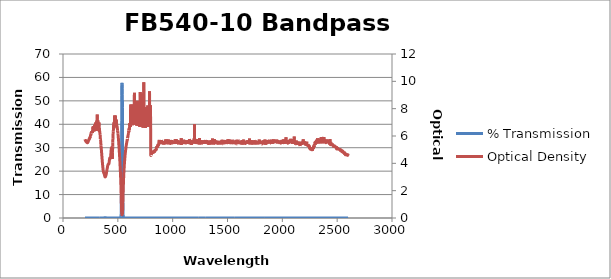
| Category | % Transmission |
|---|---|
| 2600.0 | 0.003 |
| 2599.0 | 0.002 |
| 2598.0 | 0.003 |
| 2597.0 | 0.002 |
| 2596.0 | 0.002 |
| 2595.0 | 0.002 |
| 2594.0 | 0.003 |
| 2593.0 | 0.003 |
| 2592.0 | 0.003 |
| 2591.0 | 0.003 |
| 2590.0 | 0.002 |
| 2589.0 | 0.002 |
| 2588.0 | 0.002 |
| 2587.0 | 0.003 |
| 2586.0 | 0.002 |
| 2585.0 | 0.002 |
| 2584.0 | 0.002 |
| 2583.0 | 0.003 |
| 2582.0 | 0.002 |
| 2581.0 | 0.002 |
| 2580.0 | 0.002 |
| 2579.0 | 0.003 |
| 2578.0 | 0.002 |
| 2577.0 | 0.002 |
| 2576.0 | 0.002 |
| 2575.0 | 0.002 |
| 2574.0 | 0.002 |
| 2573.0 | 0.002 |
| 2572.0 | 0.002 |
| 2571.0 | 0.002 |
| 2570.0 | 0.002 |
| 2569.0 | 0.002 |
| 2568.0 | 0.002 |
| 2567.0 | 0.002 |
| 2566.0 | 0.002 |
| 2565.0 | 0.002 |
| 2564.0 | 0.002 |
| 2563.0 | 0.002 |
| 2562.0 | 0.002 |
| 2561.0 | 0.002 |
| 2560.0 | 0.001 |
| 2559.0 | 0.002 |
| 2558.0 | 0.002 |
| 2557.0 | 0.001 |
| 2556.0 | 0.001 |
| 2555.0 | 0.001 |
| 2554.0 | 0.001 |
| 2553.0 | 0.001 |
| 2552.0 | 0.002 |
| 2551.0 | 0.001 |
| 2550.0 | 0.001 |
| 2549.0 | 0.001 |
| 2548.0 | 0.001 |
| 2547.0 | 0.001 |
| 2546.0 | 0.001 |
| 2545.0 | 0.001 |
| 2544.0 | 0.002 |
| 2543.0 | 0.001 |
| 2542.0 | 0.001 |
| 2541.0 | 0.001 |
| 2540.0 | 0.001 |
| 2539.0 | 0.001 |
| 2538.0 | 0.001 |
| 2537.0 | 0.001 |
| 2536.0 | 0.001 |
| 2535.0 | 0.001 |
| 2534.0 | 0.001 |
| 2533.0 | 0.001 |
| 2532.0 | 0.001 |
| 2531.0 | 0.001 |
| 2530.0 | 0.001 |
| 2529.0 | 0.001 |
| 2528.0 | 0.001 |
| 2527.0 | 0.001 |
| 2526.0 | 0.001 |
| 2525.0 | 0.001 |
| 2524.0 | 0.001 |
| 2523.0 | 0.001 |
| 2522.0 | 0.001 |
| 2521.0 | 0.001 |
| 2520.0 | 0.001 |
| 2519.0 | 0.001 |
| 2518.0 | 0.001 |
| 2517.0 | 0.001 |
| 2516.0 | 0.001 |
| 2515.0 | 0.001 |
| 2514.0 | 0.001 |
| 2513.0 | 0.001 |
| 2512.0 | 0.001 |
| 2511.0 | 0.001 |
| 2510.0 | 0.001 |
| 2509.0 | 0.001 |
| 2508.0 | 0.001 |
| 2507.0 | 0.001 |
| 2506.0 | 0.001 |
| 2505.0 | 0.001 |
| 2504.0 | 0.001 |
| 2503.0 | 0.001 |
| 2502.0 | 0.001 |
| 2501.0 | 0.001 |
| 2500.0 | 0.001 |
| 2499.0 | 0.001 |
| 2498.0 | 0.001 |
| 2497.0 | 0.001 |
| 2496.0 | 0.001 |
| 2495.0 | 0.001 |
| 2494.0 | 0.001 |
| 2493.0 | 0.001 |
| 2492.0 | 0.001 |
| 2491.0 | 0.001 |
| 2490.0 | 0.001 |
| 2489.0 | 0.001 |
| 2488.0 | 0.001 |
| 2487.0 | 0.001 |
| 2486.0 | 0.001 |
| 2485.0 | 0.001 |
| 2484.0 | 0.001 |
| 2483.0 | 0.001 |
| 2482.0 | 0.001 |
| 2481.0 | 0.001 |
| 2480.0 | 0.001 |
| 2479.0 | 0.001 |
| 2478.0 | 0.001 |
| 2477.0 | 0.001 |
| 2476.0 | 0.001 |
| 2475.0 | 0.001 |
| 2474.0 | 0.001 |
| 2473.0 | 0 |
| 2472.0 | 0.001 |
| 2471.0 | 0.001 |
| 2470.0 | 0.001 |
| 2469.0 | 0.001 |
| 2468.0 | 0 |
| 2467.0 | 0.001 |
| 2466.0 | 0.001 |
| 2465.0 | 0.001 |
| 2464.0 | 0.001 |
| 2463.0 | 0.001 |
| 2462.0 | 0.001 |
| 2461.0 | 0 |
| 2460.0 | 0 |
| 2459.0 | 0.001 |
| 2458.0 | 0 |
| 2457.0 | 0.001 |
| 2456.0 | 0 |
| 2455.0 | 0 |
| 2454.0 | 0 |
| 2453.0 | 0 |
| 2452.0 | 0 |
| 2451.0 | 0.001 |
| 2450.0 | 0 |
| 2449.0 | 0 |
| 2448.0 | 0 |
| 2447.0 | 0 |
| 2446.0 | 0 |
| 2445.0 | 0 |
| 2444.0 | 0 |
| 2443.0 | 0 |
| 2442.0 | 0 |
| 2441.0 | 0 |
| 2440.0 | 0 |
| 2439.0 | 0 |
| 2438.0 | 0 |
| 2437.0 | 0 |
| 2436.0 | 0 |
| 2435.0 | 0 |
| 2434.0 | 0 |
| 2433.0 | 0 |
| 2432.0 | 0 |
| 2431.0 | 0 |
| 2430.0 | 0 |
| 2429.0 | 0 |
| 2428.0 | 0 |
| 2427.0 | 0 |
| 2426.0 | 0 |
| 2425.0 | 0 |
| 2424.0 | 0 |
| 2423.0 | 0 |
| 2422.0 | 0 |
| 2421.0 | 0 |
| 2420.0 | 0 |
| 2419.0 | 0 |
| 2418.0 | 0 |
| 2417.0 | 0 |
| 2416.0 | 0 |
| 2415.0 | 0 |
| 2414.0 | 0 |
| 2413.0 | 0 |
| 2412.0 | 0 |
| 2411.0 | 0 |
| 2410.0 | 0 |
| 2409.0 | 0 |
| 2408.0 | 0 |
| 2407.0 | 0 |
| 2406.0 | 0 |
| 2405.0 | 0 |
| 2404.0 | 0 |
| 2403.0 | 0 |
| 2402.0 | 0 |
| 2401.0 | 0 |
| 2400.0 | 0 |
| 2399.0 | 0 |
| 2398.0 | 0 |
| 2397.0 | 0 |
| 2396.0 | 0 |
| 2395.0 | 0 |
| 2394.0 | 0 |
| 2393.0 | 0 |
| 2392.0 | 0 |
| 2391.0 | 0 |
| 2390.0 | 0 |
| 2389.0 | 0 |
| 2388.0 | 0 |
| 2387.0 | 0 |
| 2386.0 | 0 |
| 2385.0 | 0 |
| 2384.0 | 0 |
| 2383.0 | 0 |
| 2382.0 | 0 |
| 2381.0 | 0 |
| 2380.0 | 0 |
| 2379.0 | 0 |
| 2378.0 | 0 |
| 2377.0 | 0 |
| 2376.0 | 0 |
| 2375.0 | 0 |
| 2374.0 | 0 |
| 2373.0 | 0 |
| 2372.0 | 0 |
| 2371.0 | 0 |
| 2370.0 | 0 |
| 2369.0 | 0 |
| 2368.0 | 0 |
| 2367.0 | 0 |
| 2366.0 | 0 |
| 2365.0 | 0 |
| 2364.0 | 0 |
| 2363.0 | 0 |
| 2362.0 | 0 |
| 2361.0 | 0 |
| 2360.0 | 0 |
| 2359.0 | 0 |
| 2358.0 | 0 |
| 2357.0 | 0 |
| 2356.0 | 0 |
| 2355.0 | 0 |
| 2354.0 | 0 |
| 2353.0 | 0 |
| 2352.0 | 0 |
| 2351.0 | 0 |
| 2350.0 | 0 |
| 2349.0 | 0 |
| 2348.0 | 0 |
| 2347.0 | 0 |
| 2346.0 | 0 |
| 2345.0 | 0 |
| 2344.0 | 0 |
| 2343.0 | 0 |
| 2342.0 | 0 |
| 2341.0 | 0 |
| 2340.0 | 0 |
| 2339.0 | 0 |
| 2338.0 | 0 |
| 2337.0 | 0 |
| 2336.0 | 0 |
| 2335.0 | 0 |
| 2334.0 | 0 |
| 2333.0 | 0 |
| 2332.0 | 0 |
| 2331.0 | 0 |
| 2330.0 | 0 |
| 2329.0 | 0 |
| 2328.0 | 0 |
| 2327.0 | 0 |
| 2326.0 | 0 |
| 2325.0 | 0 |
| 2324.0 | 0 |
| 2323.0 | 0 |
| 2322.0 | 0 |
| 2321.0 | 0 |
| 2320.0 | 0 |
| 2319.0 | 0 |
| 2318.0 | 0 |
| 2317.0 | 0 |
| 2316.0 | 0 |
| 2315.0 | 0 |
| 2314.0 | 0 |
| 2313.0 | 0 |
| 2312.0 | 0 |
| 2311.0 | 0 |
| 2310.0 | 0 |
| 2309.0 | 0 |
| 2308.0 | 0 |
| 2307.0 | 0 |
| 2306.0 | 0 |
| 2305.0 | 0 |
| 2304.0 | 0 |
| 2303.0 | 0 |
| 2302.0 | 0 |
| 2301.0 | 0 |
| 2300.0 | 0 |
| 2299.0 | 0 |
| 2298.0 | 0 |
| 2297.0 | 0 |
| 2296.0 | 0 |
| 2295.0 | 0 |
| 2294.0 | 0.001 |
| 2293.0 | 0.001 |
| 2292.0 | 0 |
| 2291.0 | 0.001 |
| 2290.0 | 0.001 |
| 2289.0 | 0 |
| 2288.0 | 0.001 |
| 2287.0 | 0.001 |
| 2286.0 | 0 |
| 2285.0 | 0.001 |
| 2284.0 | 0.001 |
| 2283.0 | 0.001 |
| 2282.0 | 0.001 |
| 2281.0 | 0.001 |
| 2280.0 | 0.001 |
| 2279.0 | 0.001 |
| 2278.0 | 0.001 |
| 2277.0 | 0.001 |
| 2276.0 | 0.001 |
| 2275.0 | 0.001 |
| 2274.0 | 0.001 |
| 2273.0 | 0.001 |
| 2272.0 | 0.001 |
| 2271.0 | 0.001 |
| 2270.0 | 0.001 |
| 2269.0 | 0.001 |
| 2268.0 | 0.001 |
| 2267.0 | 0.001 |
| 2266.0 | 0.001 |
| 2265.0 | 0.001 |
| 2264.0 | 0.001 |
| 2263.0 | 0.001 |
| 2262.0 | 0.001 |
| 2261.0 | 0.001 |
| 2260.0 | 0.001 |
| 2259.0 | 0.001 |
| 2258.0 | 0.001 |
| 2257.0 | 0.001 |
| 2256.0 | 0.001 |
| 2255.0 | 0.001 |
| 2254.0 | 0.001 |
| 2253.0 | 0.001 |
| 2252.0 | 0.001 |
| 2251.0 | 0.001 |
| 2250.0 | 0.001 |
| 2249.0 | 0.001 |
| 2248.0 | 0.001 |
| 2247.0 | 0.001 |
| 2246.0 | 0.001 |
| 2245.0 | 0.001 |
| 2244.0 | 0.001 |
| 2243.0 | 0 |
| 2242.0 | 0.001 |
| 2241.0 | 0 |
| 2240.0 | 0.001 |
| 2239.0 | 0 |
| 2238.0 | 0.001 |
| 2237.0 | 0.001 |
| 2236.0 | 0 |
| 2235.0 | 0.001 |
| 2234.0 | 0 |
| 2233.0 | 0 |
| 2232.0 | 0 |
| 2231.0 | 0.001 |
| 2230.0 | 0.001 |
| 2229.0 | 0 |
| 2228.0 | 0 |
| 2227.0 | 0 |
| 2226.0 | 0 |
| 2225.0 | 0 |
| 2224.0 | 0 |
| 2223.0 | 0 |
| 2222.0 | 0 |
| 2221.0 | 0 |
| 2220.0 | 0 |
| 2219.0 | 0 |
| 2218.0 | 0 |
| 2217.0 | 0.001 |
| 2216.0 | 0 |
| 2215.0 | 0 |
| 2214.0 | 0 |
| 2213.0 | 0 |
| 2212.0 | 0 |
| 2211.0 | 0 |
| 2210.0 | 0 |
| 2209.0 | 0 |
| 2208.0 | 0 |
| 2207.0 | 0 |
| 2206.0 | 0 |
| 2205.0 | 0 |
| 2204.0 | 0 |
| 2203.0 | 0 |
| 2202.0 | 0 |
| 2201.0 | 0 |
| 2200.0 | 0 |
| 2199.0 | 0 |
| 2198.0 | 0 |
| 2197.0 | 0 |
| 2196.0 | 0 |
| 2195.0 | 0 |
| 2194.0 | 0 |
| 2193.0 | 0 |
| 2192.0 | 0 |
| 2191.0 | 0 |
| 2190.0 | 0 |
| 2189.0 | 0 |
| 2188.0 | 0 |
| 2187.0 | 0 |
| 2186.0 | 0 |
| 2185.0 | 0 |
| 2184.0 | 0 |
| 2183.0 | 0 |
| 2182.0 | 0 |
| 2181.0 | 0 |
| 2180.0 | 0 |
| 2179.0 | 0 |
| 2178.0 | 0 |
| 2177.0 | 0 |
| 2176.0 | 0 |
| 2175.0 | 0 |
| 2174.0 | 0 |
| 2173.0 | 0 |
| 2172.0 | 0 |
| 2171.0 | 0 |
| 2170.0 | 0 |
| 2169.0 | 0 |
| 2168.0 | 0 |
| 2167.0 | 0 |
| 2166.0 | 0 |
| 2165.0 | 0 |
| 2164.0 | 0 |
| 2163.0 | 0 |
| 2162.0 | 0 |
| 2161.0 | 0.001 |
| 2160.0 | 0 |
| 2159.0 | 0 |
| 2158.0 | 0 |
| 2157.0 | 0 |
| 2156.0 | 0 |
| 2155.0 | 0 |
| 2154.0 | 0 |
| 2153.0 | 0 |
| 2152.0 | 0 |
| 2151.0 | 0 |
| 2150.0 | 0 |
| 2149.0 | 0 |
| 2148.0 | 0 |
| 2147.0 | 0 |
| 2146.0 | 0 |
| 2145.0 | 0 |
| 2144.0 | 0 |
| 2143.0 | 0 |
| 2142.0 | 0 |
| 2141.0 | 0 |
| 2140.0 | 0 |
| 2139.0 | 0 |
| 2138.0 | 0 |
| 2137.0 | 0 |
| 2136.0 | 0 |
| 2135.0 | 0 |
| 2134.0 | 0 |
| 2133.0 | 0 |
| 2132.0 | 0 |
| 2131.0 | 0 |
| 2130.0 | 0 |
| 2129.0 | 0 |
| 2128.0 | 0 |
| 2127.0 | 0 |
| 2126.0 | 0 |
| 2125.0 | 0 |
| 2124.0 | 0 |
| 2123.0 | 0 |
| 2122.0 | 0 |
| 2121.0 | 0 |
| 2120.0 | 0 |
| 2119.0 | 0 |
| 2118.0 | 0 |
| 2117.0 | 0 |
| 2116.0 | 0 |
| 2115.0 | 0 |
| 2114.0 | 0 |
| 2113.0 | 0 |
| 2112.0 | 0 |
| 2111.0 | 0 |
| 2110.0 | 0 |
| 2109.0 | 0 |
| 2108.0 | 0 |
| 2107.0 | 0 |
| 2106.0 | 0 |
| 2105.0 | 0 |
| 2104.0 | 0 |
| 2103.0 | 0 |
| 2102.0 | 0 |
| 2101.0 | 0 |
| 2100.0 | 0 |
| 2099.0 | 0 |
| 2098.0 | 0 |
| 2097.0 | 0 |
| 2096.0 | 0 |
| 2095.0 | 0 |
| 2094.0 | 0 |
| 2093.0 | 0 |
| 2092.0 | 0 |
| 2091.0 | 0 |
| 2090.0 | 0 |
| 2089.0 | 0 |
| 2088.0 | 0 |
| 2087.0 | 0 |
| 2086.0 | 0 |
| 2085.0 | 0 |
| 2084.0 | 0 |
| 2083.0 | 0 |
| 2082.0 | 0 |
| 2081.0 | 0 |
| 2080.0 | 0 |
| 2079.0 | 0 |
| 2078.0 | 0 |
| 2077.0 | 0 |
| 2076.0 | 0 |
| 2075.0 | 0 |
| 2074.0 | 0 |
| 2073.0 | 0 |
| 2072.0 | 0 |
| 2071.0 | 0 |
| 2070.0 | 0 |
| 2069.0 | 0 |
| 2068.0 | 0 |
| 2067.0 | 0 |
| 2066.0 | 0 |
| 2065.0 | 0 |
| 2064.0 | 0 |
| 2063.0 | 0 |
| 2062.0 | 0 |
| 2061.0 | 0 |
| 2060.0 | 0 |
| 2059.0 | 0 |
| 2058.0 | 0 |
| 2057.0 | 0 |
| 2056.0 | 0 |
| 2055.0 | 0 |
| 2054.0 | 0 |
| 2053.0 | 0 |
| 2052.0 | 0 |
| 2051.0 | 0 |
| 2050.0 | 0 |
| 2049.0 | 0 |
| 2048.0 | 0 |
| 2047.0 | 0 |
| 2046.0 | 0 |
| 2045.0 | 0 |
| 2044.0 | 0 |
| 2043.0 | 0 |
| 2042.0 | 0 |
| 2041.0 | 0 |
| 2040.0 | 0 |
| 2039.0 | 0 |
| 2038.0 | 0 |
| 2037.0 | 0 |
| 2036.0 | 0 |
| 2035.0 | 0 |
| 2034.0 | 0 |
| 2033.0 | 0 |
| 2032.0 | 0 |
| 2031.0 | 0 |
| 2030.0 | 0 |
| 2029.0 | 0 |
| 2028.0 | 0 |
| 2027.0 | 0 |
| 2026.0 | 0 |
| 2025.0 | 0 |
| 2024.0 | 0 |
| 2023.0 | 0 |
| 2022.0 | 0 |
| 2021.0 | 0 |
| 2020.0 | 0 |
| 2019.0 | 0 |
| 2018.0 | 0 |
| 2017.0 | 0 |
| 2016.0 | 0 |
| 2015.0 | 0 |
| 2014.0 | 0 |
| 2013.0 | 0 |
| 2012.0 | 0 |
| 2011.0 | 0 |
| 2010.0 | 0 |
| 2009.0 | 0 |
| 2008.0 | 0 |
| 2007.0 | 0 |
| 2006.0 | 0 |
| 2005.0 | 0 |
| 2004.0 | 0 |
| 2003.0 | 0 |
| 2002.0 | 0 |
| 2001.0 | 0 |
| 2000.0 | 0 |
| 1999.0 | 0 |
| 1998.0 | 0 |
| 1997.0 | 0 |
| 1996.0 | 0 |
| 1995.0 | 0 |
| 1994.0 | 0 |
| 1993.0 | 0 |
| 1992.0 | 0 |
| 1991.0 | 0 |
| 1990.0 | 0 |
| 1989.0 | 0 |
| 1988.0 | 0 |
| 1987.0 | 0 |
| 1986.0 | 0 |
| 1985.0 | 0 |
| 1984.0 | 0 |
| 1983.0 | 0 |
| 1982.0 | 0 |
| 1981.0 | 0 |
| 1980.0 | 0 |
| 1979.0 | 0 |
| 1978.0 | 0 |
| 1977.0 | 0 |
| 1976.0 | 0 |
| 1975.0 | 0 |
| 1974.0 | 0 |
| 1973.0 | 0 |
| 1972.0 | 0 |
| 1971.0 | 0 |
| 1970.0 | 0 |
| 1969.0 | 0 |
| 1968.0 | 0 |
| 1967.0 | 0 |
| 1966.0 | 0 |
| 1965.0 | 0 |
| 1964.0 | 0 |
| 1963.0 | 0 |
| 1962.0 | 0 |
| 1961.0 | 0 |
| 1960.0 | 0 |
| 1959.0 | 0 |
| 1958.0 | 0 |
| 1957.0 | 0 |
| 1956.0 | 0 |
| 1955.0 | 0 |
| 1954.0 | 0 |
| 1953.0 | 0 |
| 1952.0 | 0 |
| 1951.0 | 0 |
| 1950.0 | 0 |
| 1949.0 | 0 |
| 1948.0 | 0 |
| 1947.0 | 0 |
| 1946.0 | 0 |
| 1945.0 | 0 |
| 1944.0 | 0 |
| 1943.0 | 0 |
| 1942.0 | 0 |
| 1941.0 | 0 |
| 1940.0 | 0 |
| 1939.0 | 0 |
| 1938.0 | 0 |
| 1937.0 | 0 |
| 1936.0 | 0 |
| 1935.0 | 0 |
| 1934.0 | 0 |
| 1933.0 | 0 |
| 1932.0 | 0 |
| 1931.0 | 0 |
| 1930.0 | 0 |
| 1929.0 | 0 |
| 1928.0 | 0 |
| 1927.0 | 0 |
| 1926.0 | 0 |
| 1925.0 | 0 |
| 1924.0 | 0 |
| 1923.0 | 0 |
| 1922.0 | 0 |
| 1921.0 | 0 |
| 1920.0 | 0 |
| 1919.0 | 0 |
| 1918.0 | 0 |
| 1917.0 | 0 |
| 1916.0 | 0 |
| 1915.0 | 0 |
| 1914.0 | 0 |
| 1913.0 | 0 |
| 1912.0 | 0 |
| 1911.0 | 0 |
| 1910.0 | 0 |
| 1909.0 | 0 |
| 1908.0 | 0 |
| 1907.0 | 0 |
| 1906.0 | 0 |
| 1905.0 | 0 |
| 1904.0 | 0 |
| 1903.0 | 0 |
| 1902.0 | 0 |
| 1901.0 | 0 |
| 1900.0 | 0 |
| 1899.0 | 0 |
| 1898.0 | 0 |
| 1897.0 | 0 |
| 1896.0 | 0 |
| 1895.0 | 0 |
| 1894.0 | 0 |
| 1893.0 | 0 |
| 1892.0 | 0 |
| 1891.0 | 0 |
| 1890.0 | 0 |
| 1889.0 | 0 |
| 1888.0 | 0 |
| 1887.0 | 0 |
| 1886.0 | 0 |
| 1885.0 | 0 |
| 1884.0 | 0 |
| 1883.0 | 0 |
| 1882.0 | 0 |
| 1881.0 | 0 |
| 1880.0 | 0 |
| 1879.0 | 0 |
| 1878.0 | 0 |
| 1877.0 | 0 |
| 1876.0 | 0 |
| 1875.0 | 0 |
| 1874.0 | 0 |
| 1873.0 | 0 |
| 1872.0 | 0 |
| 1871.0 | 0 |
| 1870.0 | 0 |
| 1869.0 | 0 |
| 1868.0 | 0 |
| 1867.0 | 0 |
| 1866.0 | 0 |
| 1865.0 | 0 |
| 1864.0 | 0 |
| 1863.0 | 0 |
| 1862.0 | 0 |
| 1861.0 | 0 |
| 1860.0 | 0 |
| 1859.0 | 0 |
| 1858.0 | 0 |
| 1857.0 | 0 |
| 1856.0 | 0 |
| 1855.0 | 0 |
| 1854.0 | 0 |
| 1853.0 | 0 |
| 1852.0 | 0 |
| 1851.0 | 0 |
| 1850.0 | 0 |
| 1849.0 | 0 |
| 1848.0 | 0 |
| 1847.0 | 0 |
| 1846.0 | 0 |
| 1845.0 | 0 |
| 1844.0 | 0 |
| 1843.0 | 0 |
| 1842.0 | 0 |
| 1841.0 | 0 |
| 1840.0 | 0 |
| 1839.0 | 0 |
| 1838.0 | 0 |
| 1837.0 | 0 |
| 1836.0 | 0 |
| 1835.0 | 0 |
| 1834.0 | 0 |
| 1833.0 | 0 |
| 1832.0 | 0 |
| 1831.0 | 0 |
| 1830.0 | 0 |
| 1829.0 | 0 |
| 1828.0 | 0 |
| 1827.0 | 0 |
| 1826.0 | 0 |
| 1825.0 | 0 |
| 1824.0 | 0 |
| 1823.0 | 0 |
| 1822.0 | 0 |
| 1821.0 | 0 |
| 1820.0 | 0 |
| 1819.0 | 0 |
| 1818.0 | 0 |
| 1817.0 | 0 |
| 1816.0 | 0 |
| 1815.0 | 0 |
| 1814.0 | 0 |
| 1813.0 | 0 |
| 1812.0 | 0 |
| 1811.0 | 0 |
| 1810.0 | 0 |
| 1809.0 | 0 |
| 1808.0 | 0 |
| 1807.0 | 0 |
| 1806.0 | 0 |
| 1805.0 | 0 |
| 1804.0 | 0 |
| 1803.0 | 0 |
| 1802.0 | 0 |
| 1801.0 | 0 |
| 1800.0 | 0 |
| 1799.0 | 0 |
| 1798.0 | 0 |
| 1797.0 | 0 |
| 1796.0 | 0 |
| 1795.0 | 0 |
| 1794.0 | 0 |
| 1793.0 | 0 |
| 1792.0 | 0 |
| 1791.0 | 0 |
| 1790.0 | 0 |
| 1789.0 | 0 |
| 1788.0 | 0 |
| 1787.0 | 0 |
| 1786.0 | 0 |
| 1785.0 | 0 |
| 1784.0 | 0 |
| 1783.0 | 0 |
| 1782.0 | 0 |
| 1781.0 | 0 |
| 1780.0 | 0 |
| 1779.0 | 0 |
| 1778.0 | 0 |
| 1777.0 | 0 |
| 1776.0 | 0 |
| 1775.0 | 0 |
| 1774.0 | 0 |
| 1773.0 | 0 |
| 1772.0 | 0 |
| 1771.0 | 0 |
| 1770.0 | 0 |
| 1769.0 | 0 |
| 1768.0 | 0 |
| 1767.0 | 0 |
| 1766.0 | 0 |
| 1765.0 | 0 |
| 1764.0 | 0 |
| 1763.0 | 0 |
| 1762.0 | 0 |
| 1761.0 | 0 |
| 1760.0 | 0 |
| 1759.0 | 0 |
| 1758.0 | 0 |
| 1757.0 | 0 |
| 1756.0 | 0 |
| 1755.0 | 0 |
| 1754.0 | 0 |
| 1753.0 | 0 |
| 1752.0 | 0 |
| 1751.0 | 0 |
| 1750.0 | 0 |
| 1749.0 | 0 |
| 1748.0 | 0 |
| 1747.0 | 0 |
| 1746.0 | 0 |
| 1745.0 | 0 |
| 1744.0 | 0 |
| 1743.0 | 0 |
| 1742.0 | 0 |
| 1741.0 | 0 |
| 1740.0 | 0 |
| 1739.0 | 0 |
| 1738.0 | 0 |
| 1737.0 | 0 |
| 1736.0 | 0 |
| 1735.0 | 0 |
| 1734.0 | 0 |
| 1733.0 | 0 |
| 1732.0 | 0 |
| 1731.0 | 0 |
| 1730.0 | 0 |
| 1729.0 | 0 |
| 1728.0 | 0 |
| 1727.0 | 0 |
| 1726.0 | 0 |
| 1725.0 | 0 |
| 1724.0 | 0 |
| 1723.0 | 0 |
| 1722.0 | 0 |
| 1721.0 | 0 |
| 1720.0 | 0 |
| 1719.0 | 0 |
| 1718.0 | 0 |
| 1717.0 | 0 |
| 1716.0 | 0 |
| 1715.0 | 0 |
| 1714.0 | 0 |
| 1713.0 | 0 |
| 1712.0 | 0 |
| 1711.0 | 0 |
| 1710.0 | 0 |
| 1709.0 | 0 |
| 1708.0 | 0 |
| 1707.0 | 0 |
| 1706.0 | 0 |
| 1705.0 | 0 |
| 1704.0 | 0 |
| 1703.0 | 0 |
| 1702.0 | 0 |
| 1701.0 | 0 |
| 1700.0 | 0 |
| 1699.0 | 0 |
| 1698.0 | 0 |
| 1697.0 | 0 |
| 1696.0 | 0 |
| 1695.0 | 0 |
| 1694.0 | 0 |
| 1693.0 | 0 |
| 1692.0 | 0 |
| 1691.0 | 0 |
| 1690.0 | 0 |
| 1689.0 | 0 |
| 1688.0 | 0 |
| 1687.0 | 0 |
| 1686.0 | 0 |
| 1685.0 | 0 |
| 1684.0 | 0 |
| 1683.0 | 0 |
| 1682.0 | 0 |
| 1681.0 | 0 |
| 1680.0 | 0 |
| 1679.0 | 0 |
| 1678.0 | 0 |
| 1677.0 | 0 |
| 1676.0 | 0 |
| 1675.0 | 0 |
| 1674.0 | 0 |
| 1673.0 | 0 |
| 1672.0 | 0 |
| 1671.0 | 0 |
| 1670.0 | 0 |
| 1669.0 | 0 |
| 1668.0 | 0 |
| 1667.0 | 0 |
| 1666.0 | 0 |
| 1665.0 | 0 |
| 1664.0 | 0 |
| 1663.0 | 0 |
| 1662.0 | 0 |
| 1661.0 | 0 |
| 1660.0 | 0 |
| 1659.0 | 0 |
| 1658.0 | 0 |
| 1657.0 | 0 |
| 1656.0 | 0 |
| 1655.0 | 0 |
| 1654.0 | 0 |
| 1653.0 | 0 |
| 1652.0 | 0 |
| 1651.0 | 0 |
| 1650.0 | 0 |
| 1649.0 | 0 |
| 1648.0 | 0 |
| 1647.0 | 0 |
| 1646.0 | 0 |
| 1645.0 | 0 |
| 1644.0 | 0 |
| 1643.0 | 0 |
| 1642.0 | 0 |
| 1641.0 | 0 |
| 1640.0 | 0 |
| 1639.0 | 0 |
| 1638.0 | 0 |
| 1637.0 | 0 |
| 1636.0 | 0 |
| 1635.0 | 0 |
| 1634.0 | 0 |
| 1633.0 | 0 |
| 1632.0 | 0 |
| 1631.0 | 0 |
| 1630.0 | 0 |
| 1629.0 | 0 |
| 1628.0 | 0 |
| 1627.0 | 0 |
| 1626.0 | 0 |
| 1625.0 | 0 |
| 1624.0 | 0 |
| 1623.0 | 0 |
| 1622.0 | 0 |
| 1621.0 | 0 |
| 1620.0 | 0 |
| 1619.0 | 0 |
| 1618.0 | 0 |
| 1617.0 | 0 |
| 1616.0 | 0 |
| 1615.0 | 0 |
| 1614.0 | 0 |
| 1613.0 | 0 |
| 1612.0 | 0 |
| 1611.0 | 0 |
| 1610.0 | 0 |
| 1609.0 | 0 |
| 1608.0 | 0 |
| 1607.0 | 0 |
| 1606.0 | 0 |
| 1605.0 | 0 |
| 1604.0 | 0 |
| 1603.0 | 0 |
| 1602.0 | 0 |
| 1601.0 | 0 |
| 1600.0 | 0 |
| 1599.0 | 0 |
| 1598.0 | 0 |
| 1597.0 | 0 |
| 1596.0 | 0 |
| 1595.0 | 0 |
| 1594.0 | 0 |
| 1593.0 | 0 |
| 1592.0 | 0 |
| 1591.0 | 0 |
| 1590.0 | 0 |
| 1589.0 | 0 |
| 1588.0 | 0 |
| 1587.0 | 0 |
| 1586.0 | 0 |
| 1585.0 | 0 |
| 1584.0 | 0 |
| 1583.0 | 0 |
| 1582.0 | 0 |
| 1581.0 | 0 |
| 1580.0 | 0 |
| 1579.0 | 0 |
| 1578.0 | 0 |
| 1577.0 | 0 |
| 1576.0 | 0 |
| 1575.0 | 0 |
| 1574.0 | 0 |
| 1573.0 | 0 |
| 1572.0 | 0 |
| 1571.0 | 0 |
| 1570.0 | 0 |
| 1569.0 | 0 |
| 1568.0 | 0 |
| 1567.0 | 0 |
| 1566.0 | 0 |
| 1565.0 | 0 |
| 1564.0 | 0 |
| 1563.0 | 0 |
| 1562.0 | 0 |
| 1561.0 | 0 |
| 1560.0 | 0 |
| 1559.0 | 0 |
| 1558.0 | 0 |
| 1557.0 | 0 |
| 1556.0 | 0 |
| 1555.0 | 0 |
| 1554.0 | 0 |
| 1553.0 | 0 |
| 1552.0 | 0 |
| 1551.0 | 0 |
| 1550.0 | 0 |
| 1549.0 | 0 |
| 1548.0 | 0 |
| 1547.0 | 0 |
| 1546.0 | 0 |
| 1545.0 | 0 |
| 1544.0 | 0 |
| 1543.0 | 0 |
| 1542.0 | 0 |
| 1541.0 | 0 |
| 1540.0 | 0 |
| 1539.0 | 0 |
| 1538.0 | 0 |
| 1537.0 | 0 |
| 1536.0 | 0 |
| 1535.0 | 0 |
| 1534.0 | 0 |
| 1533.0 | 0 |
| 1532.0 | 0 |
| 1531.0 | 0 |
| 1530.0 | 0 |
| 1529.0 | 0 |
| 1528.0 | 0 |
| 1527.0 | 0 |
| 1526.0 | 0 |
| 1525.0 | 0 |
| 1524.0 | 0 |
| 1523.0 | 0 |
| 1522.0 | 0 |
| 1521.0 | 0 |
| 1520.0 | 0 |
| 1519.0 | 0 |
| 1518.0 | 0 |
| 1517.0 | 0 |
| 1516.0 | 0 |
| 1515.0 | 0 |
| 1514.0 | 0 |
| 1513.0 | 0 |
| 1512.0 | 0 |
| 1511.0 | 0 |
| 1510.0 | 0 |
| 1509.0 | 0 |
| 1508.0 | 0 |
| 1507.0 | 0 |
| 1506.0 | 0 |
| 1505.0 | 0 |
| 1504.0 | 0 |
| 1503.0 | 0 |
| 1502.0 | 0 |
| 1501.0 | 0 |
| 1500.0 | 0 |
| 1499.0 | 0 |
| 1498.0 | 0 |
| 1497.0 | 0 |
| 1496.0 | 0 |
| 1495.0 | 0 |
| 1494.0 | 0 |
| 1493.0 | 0 |
| 1492.0 | 0 |
| 1491.0 | 0 |
| 1490.0 | 0 |
| 1489.0 | 0 |
| 1488.0 | 0 |
| 1487.0 | 0 |
| 1486.0 | 0 |
| 1485.0 | 0 |
| 1484.0 | 0 |
| 1483.0 | 0 |
| 1482.0 | 0 |
| 1481.0 | 0 |
| 1480.0 | 0 |
| 1479.0 | 0 |
| 1478.0 | 0 |
| 1477.0 | 0 |
| 1476.0 | 0 |
| 1475.0 | 0 |
| 1474.0 | 0 |
| 1473.0 | 0 |
| 1472.0 | 0 |
| 1471.0 | 0 |
| 1470.0 | 0 |
| 1469.0 | 0 |
| 1468.0 | 0 |
| 1467.0 | 0 |
| 1466.0 | 0 |
| 1465.0 | 0 |
| 1464.0 | 0 |
| 1463.0 | 0 |
| 1462.0 | 0 |
| 1461.0 | 0 |
| 1460.0 | 0 |
| 1459.0 | 0 |
| 1458.0 | 0 |
| 1457.0 | 0 |
| 1456.0 | 0 |
| 1455.0 | 0 |
| 1454.0 | 0 |
| 1453.0 | 0 |
| 1452.0 | 0 |
| 1451.0 | 0 |
| 1450.0 | 0 |
| 1449.0 | 0 |
| 1448.0 | 0 |
| 1447.0 | 0 |
| 1446.0 | 0 |
| 1445.0 | 0 |
| 1444.0 | 0 |
| 1443.0 | 0 |
| 1442.0 | 0 |
| 1441.0 | 0 |
| 1440.0 | 0 |
| 1439.0 | 0 |
| 1438.0 | 0 |
| 1437.0 | 0 |
| 1436.0 | 0 |
| 1435.0 | 0 |
| 1434.0 | 0 |
| 1433.0 | 0 |
| 1432.0 | 0 |
| 1431.0 | 0 |
| 1430.0 | 0 |
| 1429.0 | 0 |
| 1428.0 | 0 |
| 1427.0 | 0 |
| 1426.0 | 0 |
| 1425.0 | 0 |
| 1424.0 | 0 |
| 1423.0 | 0 |
| 1422.0 | 0 |
| 1421.0 | 0 |
| 1420.0 | 0 |
| 1419.0 | 0 |
| 1418.0 | 0 |
| 1417.0 | 0 |
| 1416.0 | 0 |
| 1415.0 | 0 |
| 1414.0 | 0 |
| 1413.0 | 0 |
| 1412.0 | 0 |
| 1411.0 | 0 |
| 1410.0 | 0 |
| 1409.0 | 0 |
| 1408.0 | 0 |
| 1407.0 | 0 |
| 1406.0 | 0 |
| 1405.0 | 0 |
| 1404.0 | 0 |
| 1403.0 | 0 |
| 1402.0 | 0 |
| 1401.0 | 0 |
| 1400.0 | 0 |
| 1399.0 | 0 |
| 1398.0 | 0 |
| 1397.0 | 0 |
| 1396.0 | 0 |
| 1395.0 | 0 |
| 1394.0 | 0 |
| 1393.0 | 0 |
| 1392.0 | 0 |
| 1391.0 | 0 |
| 1390.0 | 0 |
| 1389.0 | 0 |
| 1388.0 | 0 |
| 1387.0 | 0 |
| 1386.0 | 0 |
| 1385.0 | 0 |
| 1384.0 | 0 |
| 1383.0 | 0 |
| 1382.0 | 0 |
| 1381.0 | 0 |
| 1380.0 | 0 |
| 1379.0 | 0 |
| 1378.0 | 0 |
| 1377.0 | 0 |
| 1376.0 | 0 |
| 1375.0 | 0 |
| 1374.0 | 0 |
| 1373.0 | 0 |
| 1372.0 | 0 |
| 1371.0 | 0 |
| 1370.0 | 0 |
| 1369.0 | 0 |
| 1368.0 | 0 |
| 1367.0 | 0 |
| 1366.0 | 0 |
| 1365.0 | 0 |
| 1364.0 | 0 |
| 1363.0 | 0 |
| 1362.0 | 0 |
| 1361.0 | 0 |
| 1360.0 | 0 |
| 1359.0 | 0 |
| 1358.0 | 0 |
| 1357.0 | 0 |
| 1356.0 | 0 |
| 1355.0 | 0 |
| 1354.0 | 0 |
| 1353.0 | 0 |
| 1352.0 | 0 |
| 1351.0 | 0 |
| 1350.0 | 0 |
| 1349.0 | 0 |
| 1348.0 | 0 |
| 1347.0 | 0 |
| 1346.0 | 0 |
| 1345.0 | 0 |
| 1344.0 | 0 |
| 1343.0 | 0 |
| 1342.0 | 0 |
| 1341.0 | 0 |
| 1340.0 | 0 |
| 1339.0 | 0 |
| 1338.0 | 0 |
| 1337.0 | 0 |
| 1336.0 | 0 |
| 1335.0 | 0 |
| 1334.0 | 0 |
| 1333.0 | 0 |
| 1332.0 | 0 |
| 1331.0 | 0 |
| 1330.0 | 0 |
| 1329.0 | 0 |
| 1328.0 | 0 |
| 1327.0 | 0 |
| 1326.0 | 0 |
| 1325.0 | 0 |
| 1324.0 | 0 |
| 1323.0 | 0 |
| 1322.0 | 0 |
| 1321.0 | 0 |
| 1320.0 | 0 |
| 1319.0 | 0 |
| 1318.0 | 0 |
| 1317.0 | 0 |
| 1316.0 | 0 |
| 1315.0 | 0 |
| 1314.0 | 0 |
| 1313.0 | 0 |
| 1312.0 | 0 |
| 1311.0 | 0 |
| 1310.0 | 0 |
| 1309.0 | 0 |
| 1308.0 | 0 |
| 1307.0 | 0 |
| 1306.0 | 0 |
| 1305.0 | 0 |
| 1304.0 | 0 |
| 1303.0 | 0 |
| 1302.0 | 0 |
| 1301.0 | 0 |
| 1300.0 | 0 |
| 1299.0 | 0 |
| 1298.0 | 0 |
| 1297.0 | 0 |
| 1296.0 | 0 |
| 1295.0 | 0 |
| 1294.0 | 0 |
| 1293.0 | 0 |
| 1292.0 | 0 |
| 1291.0 | 0 |
| 1290.0 | 0 |
| 1289.0 | 0 |
| 1288.0 | 0 |
| 1287.0 | 0 |
| 1286.0 | 0 |
| 1285.0 | 0 |
| 1284.0 | 0 |
| 1283.0 | 0 |
| 1282.0 | 0 |
| 1281.0 | 0 |
| 1280.0 | 0 |
| 1279.0 | 0 |
| 1278.0 | 0 |
| 1277.0 | 0 |
| 1276.0 | 0 |
| 1275.0 | 0 |
| 1274.0 | 0 |
| 1273.0 | 0 |
| 1272.0 | 0 |
| 1271.0 | 0 |
| 1270.0 | 0 |
| 1269.0 | 0 |
| 1268.0 | 0 |
| 1267.0 | 0 |
| 1266.0 | 0 |
| 1265.0 | 0 |
| 1264.0 | 0 |
| 1263.0 | 0 |
| 1262.0 | 0 |
| 1261.0 | 0 |
| 1260.0 | 0 |
| 1259.0 | 0 |
| 1258.0 | 0 |
| 1257.0 | 0 |
| 1256.0 | 0 |
| 1255.0 | 0 |
| 1254.0 | 0 |
| 1253.0 | 0 |
| 1252.0 | 0 |
| 1251.0 | 0 |
| 1250.0 | 0 |
| 1249.0 | 0 |
| 1248.0 | 0 |
| 1247.0 | 0 |
| 1246.0 | 0 |
| 1245.0 | 0 |
| 1244.0 | 0 |
| 1243.0 | 0 |
| 1242.0 | 0 |
| 1241.0 | 0 |
| 1240.0 | 0 |
| 1239.0 | 0 |
| 1238.0 | 0 |
| 1237.0 | 0 |
| 1236.0 | 0 |
| 1235.0 | 0 |
| 1234.0 | 0 |
| 1233.0 | 0 |
| 1232.0 | 0 |
| 1231.0 | 0 |
| 1230.0 | 0 |
| 1229.0 | 0 |
| 1228.0 | 0 |
| 1227.0 | 0 |
| 1226.0 | 0 |
| 1225.0 | 0 |
| 1224.0 | 0 |
| 1223.0 | 0 |
| 1222.0 | 0 |
| 1221.0 | 0 |
| 1220.0 | 0 |
| 1219.0 | 0 |
| 1218.0 | 0 |
| 1217.0 | 0 |
| 1216.0 | 0 |
| 1215.0 | 0 |
| 1214.0 | 0 |
| 1213.0 | 0 |
| 1212.0 | 0 |
| 1211.0 | 0 |
| 1210.0 | 0 |
| 1209.0 | 0 |
| 1208.0 | 0 |
| 1207.0 | 0 |
| 1206.0 | 0 |
| 1205.0 | 0 |
| 1204.0 | 0 |
| 1203.0 | 0 |
| 1202.0 | 0 |
| 1201.0 | 0 |
| 1200.0 | 0 |
| 1199.0 | 0 |
| 1198.0 | 0 |
| 1197.0 | 0 |
| 1196.0 | 0 |
| 1195.0 | 0 |
| 1194.0 | 0 |
| 1193.0 | 0 |
| 1192.0 | 0 |
| 1191.0 | 0 |
| 1190.0 | 0 |
| 1189.0 | 0 |
| 1188.0 | 0 |
| 1187.0 | 0 |
| 1186.0 | 0 |
| 1185.0 | 0 |
| 1184.0 | 0 |
| 1183.0 | 0 |
| 1182.0 | 0 |
| 1181.0 | 0 |
| 1180.0 | 0 |
| 1179.0 | 0 |
| 1178.0 | 0 |
| 1177.0 | 0 |
| 1176.0 | 0 |
| 1175.0 | 0 |
| 1174.0 | 0 |
| 1173.0 | 0 |
| 1172.0 | 0 |
| 1171.0 | 0 |
| 1170.0 | 0 |
| 1169.0 | 0 |
| 1168.0 | 0 |
| 1167.0 | 0 |
| 1166.0 | 0 |
| 1165.0 | 0 |
| 1164.0 | 0 |
| 1163.0 | 0 |
| 1162.0 | 0 |
| 1161.0 | 0 |
| 1160.0 | 0 |
| 1159.0 | 0 |
| 1158.0 | 0 |
| 1157.0 | 0 |
| 1156.0 | 0 |
| 1155.0 | 0 |
| 1154.0 | 0 |
| 1153.0 | 0 |
| 1152.0 | 0 |
| 1151.0 | 0 |
| 1150.0 | 0 |
| 1149.0 | 0 |
| 1148.0 | 0 |
| 1147.0 | 0 |
| 1146.0 | 0 |
| 1145.0 | 0 |
| 1144.0 | 0 |
| 1143.0 | 0 |
| 1142.0 | 0 |
| 1141.0 | 0 |
| 1140.0 | 0 |
| 1139.0 | 0 |
| 1138.0 | 0 |
| 1137.0 | 0 |
| 1136.0 | 0 |
| 1135.0 | 0 |
| 1134.0 | 0 |
| 1133.0 | 0 |
| 1132.0 | 0 |
| 1131.0 | 0 |
| 1130.0 | 0 |
| 1129.0 | 0 |
| 1128.0 | 0 |
| 1127.0 | 0 |
| 1126.0 | 0 |
| 1125.0 | 0 |
| 1124.0 | 0 |
| 1123.0 | 0 |
| 1122.0 | 0 |
| 1121.0 | 0 |
| 1120.0 | 0 |
| 1119.0 | 0 |
| 1118.0 | 0 |
| 1117.0 | 0 |
| 1116.0 | 0 |
| 1115.0 | 0 |
| 1114.0 | 0 |
| 1113.0 | 0 |
| 1112.0 | 0 |
| 1111.0 | 0 |
| 1110.0 | 0 |
| 1109.0 | 0 |
| 1108.0 | 0 |
| 1107.0 | 0 |
| 1106.0 | 0 |
| 1105.0 | 0 |
| 1104.0 | 0 |
| 1103.0 | 0 |
| 1102.0 | 0 |
| 1101.0 | 0 |
| 1100.0 | 0 |
| 1099.0 | 0 |
| 1098.0 | 0 |
| 1097.0 | 0 |
| 1096.0 | 0 |
| 1095.0 | 0 |
| 1094.0 | 0 |
| 1093.0 | 0 |
| 1092.0 | 0 |
| 1091.0 | 0 |
| 1090.0 | 0 |
| 1089.0 | 0 |
| 1088.0 | 0 |
| 1087.0 | 0 |
| 1086.0 | 0 |
| 1085.0 | 0 |
| 1084.0 | 0 |
| 1083.0 | 0 |
| 1082.0 | 0 |
| 1081.0 | 0 |
| 1080.0 | 0 |
| 1079.0 | 0 |
| 1078.0 | 0 |
| 1077.0 | 0 |
| 1076.0 | 0 |
| 1075.0 | 0 |
| 1074.0 | 0 |
| 1073.0 | 0 |
| 1072.0 | 0 |
| 1071.0 | 0 |
| 1070.0 | 0 |
| 1069.0 | 0 |
| 1068.0 | 0 |
| 1067.0 | 0 |
| 1066.0 | 0 |
| 1065.0 | 0 |
| 1064.0 | 0 |
| 1063.0 | 0 |
| 1062.0 | 0 |
| 1061.0 | 0 |
| 1060.0 | 0 |
| 1059.0 | 0 |
| 1058.0 | 0 |
| 1057.0 | 0 |
| 1056.0 | 0 |
| 1055.0 | 0 |
| 1054.0 | 0 |
| 1053.0 | 0 |
| 1052.0 | 0 |
| 1051.0 | 0 |
| 1050.0 | 0 |
| 1049.0 | 0 |
| 1048.0 | 0 |
| 1047.0 | 0 |
| 1046.0 | 0 |
| 1045.0 | 0 |
| 1044.0 | 0 |
| 1043.0 | 0 |
| 1042.0 | 0 |
| 1041.0 | 0 |
| 1040.0 | 0 |
| 1039.0 | 0 |
| 1038.0 | 0 |
| 1037.0 | 0 |
| 1036.0 | 0 |
| 1035.0 | 0 |
| 1034.0 | 0 |
| 1033.0 | 0 |
| 1032.0 | 0 |
| 1031.0 | 0 |
| 1030.0 | 0 |
| 1029.0 | 0 |
| 1028.0 | 0 |
| 1027.0 | 0 |
| 1026.0 | 0 |
| 1025.0 | 0 |
| 1024.0 | 0 |
| 1023.0 | 0 |
| 1022.0 | 0 |
| 1021.0 | 0 |
| 1020.0 | 0 |
| 1019.0 | 0 |
| 1018.0 | 0 |
| 1017.0 | 0 |
| 1016.0 | 0 |
| 1015.0 | 0 |
| 1014.0 | 0 |
| 1013.0 | 0 |
| 1012.0 | 0 |
| 1011.0 | 0 |
| 1010.0 | 0 |
| 1009.0 | 0 |
| 1008.0 | 0 |
| 1007.0 | 0 |
| 1006.0 | 0 |
| 1005.0 | 0 |
| 1004.0 | 0 |
| 1003.0 | 0 |
| 1002.0 | 0 |
| 1001.0 | 0 |
| 1000.0 | 0 |
| 999.0 | 0 |
| 998.0 | 0 |
| 997.0 | 0 |
| 996.0 | 0 |
| 995.0 | 0 |
| 994.0 | 0 |
| 993.0 | 0 |
| 992.0 | 0 |
| 991.0 | 0 |
| 990.0 | 0 |
| 989.0 | 0 |
| 988.0 | 0 |
| 987.0 | 0 |
| 986.0 | 0 |
| 985.0 | 0 |
| 984.0 | 0 |
| 983.0 | 0 |
| 982.0 | 0 |
| 981.0 | 0 |
| 980.0 | 0 |
| 979.0 | 0 |
| 978.0 | 0 |
| 977.0 | 0 |
| 976.0 | 0 |
| 975.0 | 0 |
| 974.0 | 0 |
| 973.0 | 0 |
| 972.0 | 0 |
| 971.0 | 0 |
| 970.0 | 0 |
| 969.0 | 0 |
| 968.0 | 0 |
| 967.0 | 0 |
| 966.0 | 0 |
| 965.0 | 0 |
| 964.0 | 0 |
| 963.0 | 0 |
| 962.0 | 0 |
| 961.0 | 0 |
| 960.0 | 0 |
| 959.0 | 0 |
| 958.0 | 0 |
| 957.0 | 0 |
| 956.0 | 0 |
| 955.0 | 0 |
| 954.0 | 0 |
| 953.0 | 0 |
| 952.0 | 0 |
| 951.0 | 0 |
| 950.0 | 0 |
| 949.0 | 0 |
| 948.0 | 0 |
| 947.0 | 0 |
| 946.0 | 0 |
| 945.0 | 0 |
| 944.0 | 0 |
| 943.0 | 0 |
| 942.0 | 0 |
| 941.0 | 0 |
| 940.0 | 0 |
| 939.0 | 0 |
| 938.0 | 0 |
| 937.0 | 0 |
| 936.0 | 0 |
| 935.0 | 0 |
| 934.0 | 0 |
| 933.0 | 0 |
| 932.0 | 0 |
| 931.0 | 0 |
| 930.0 | 0 |
| 929.0 | 0 |
| 928.0 | 0 |
| 927.0 | 0 |
| 926.0 | 0 |
| 925.0 | 0 |
| 924.0 | 0 |
| 923.0 | 0 |
| 922.0 | 0 |
| 921.0 | 0 |
| 920.0 | 0 |
| 919.0 | 0 |
| 918.0 | 0 |
| 917.0 | 0 |
| 916.0 | 0 |
| 915.0 | 0 |
| 914.0 | 0 |
| 913.0 | 0 |
| 912.0 | 0 |
| 911.0 | 0 |
| 910.0 | 0 |
| 909.0 | 0 |
| 908.0 | 0 |
| 907.0 | 0 |
| 906.0 | 0 |
| 905.0 | 0 |
| 904.0 | 0 |
| 903.0 | 0 |
| 902.0 | 0 |
| 901.0 | 0 |
| 900.0 | 0 |
| 899.0 | 0 |
| 898.0 | 0 |
| 897.0 | 0 |
| 896.0 | 0 |
| 895.0 | 0 |
| 894.0 | 0 |
| 893.0 | 0 |
| 892.0 | 0 |
| 891.0 | 0 |
| 890.0 | 0 |
| 889.0 | 0 |
| 888.0 | 0 |
| 887.0 | 0 |
| 886.0 | 0 |
| 885.0 | 0 |
| 884.0 | 0 |
| 883.0 | 0 |
| 882.0 | 0 |
| 881.0 | 0 |
| 880.0 | 0 |
| 879.0 | 0 |
| 878.0 | 0 |
| 877.0 | 0 |
| 876.0 | 0 |
| 875.0 | 0 |
| 874.0 | 0 |
| 873.0 | 0 |
| 872.0 | 0 |
| 871.0 | 0 |
| 870.0 | 0 |
| 869.0 | 0 |
| 868.0 | 0 |
| 867.0 | 0.001 |
| 866.0 | 0 |
| 865.0 | 0 |
| 864.0 | 0.001 |
| 863.0 | 0.001 |
| 862.0 | 0.001 |
| 861.0 | 0.001 |
| 860.0 | 0.001 |
| 859.0 | 0.001 |
| 858.0 | 0.001 |
| 857.0 | 0.001 |
| 856.0 | 0.001 |
| 855.0 | 0.001 |
| 854.0 | 0.001 |
| 853.0 | 0.001 |
| 852.0 | 0.001 |
| 851.0 | 0.001 |
| 850.0 | 0.001 |
| 849.0 | 0.001 |
| 848.0 | 0.001 |
| 847.0 | 0.001 |
| 846.0 | 0.001 |
| 845.0 | 0.001 |
| 844.0 | 0.001 |
| 843.0 | 0.001 |
| 842.0 | 0.001 |
| 841.0 | 0.001 |
| 840.0 | 0.001 |
| 839.0 | 0.001 |
| 838.0 | 0.001 |
| 837.0 | 0.001 |
| 836.0 | 0.001 |
| 835.0 | 0.001 |
| 834.0 | 0.001 |
| 833.0 | 0.001 |
| 832.0 | 0.001 |
| 831.0 | 0.001 |
| 830.0 | 0.001 |
| 829.0 | 0.001 |
| 828.0 | 0.001 |
| 827.0 | 0.001 |
| 826.0 | 0.002 |
| 825.0 | 0.001 |
| 824.0 | 0.001 |
| 823.0 | 0.001 |
| 822.0 | 0.002 |
| 821.0 | 0.002 |
| 820.0 | 0.001 |
| 819.0 | 0.002 |
| 818.0 | 0.002 |
| 817.0 | 0.002 |
| 816.0 | 0.002 |
| 815.0 | 0.001 |
| 814.0 | 0.002 |
| 813.0 | 0.002 |
| 812.0 | 0.002 |
| 811.0 | 0.002 |
| 810.0 | 0.002 |
| 809.0 | 0.002 |
| 808.0 | 0.002 |
| 807.0 | 0.002 |
| 806.0 | 0.002 |
| 805.0 | 0.002 |
| 804.0 | 0.002 |
| 803.0 | 0.002 |
| 802.0 | 0.003 |
| 801.0 | 0.003 |
| 800.0 | 0.002 |
| 799.0 | 0 |
| 798.0 | 0 |
| 797.0 | 0 |
| 796.0 | 0 |
| 795.0 | 0 |
| 794.0 | 0 |
| 793.0 | 0 |
| 792.0 | 0 |
| 791.0 | 0 |
| 790.0 | 0 |
| 789.0 | 0 |
| 788.0 | 0 |
| 787.0 | 0 |
| 786.0 | 0 |
| 785.0 | 0 |
| 784.0 | 0 |
| 783.0 | 0 |
| 782.0 | 0 |
| 781.0 | 0 |
| 780.0 | 0 |
| 779.0 | 0 |
| 778.0 | 0 |
| 777.0 | 0 |
| 776.0 | 0 |
| 775.0 | 0 |
| 774.0 | 0 |
| 773.0 | 0 |
| 772.0 | 0 |
| 771.0 | 0 |
| 770.0 | 0 |
| 769.0 | 0 |
| 768.0 | 0 |
| 767.0 | 0 |
| 766.0 | 0 |
| 765.0 | 0 |
| 764.0 | 0 |
| 763.0 | 0 |
| 762.0 | 0 |
| 761.0 | 0 |
| 760.0 | 0 |
| 759.0 | 0 |
| 758.0 | 0 |
| 757.0 | 0 |
| 756.0 | 0 |
| 755.0 | 0 |
| 754.0 | 0 |
| 753.0 | 0 |
| 752.0 | 0 |
| 751.0 | 0 |
| 750.0 | 0 |
| 749.0 | 0 |
| 748.0 | 0 |
| 747.0 | 0 |
| 746.0 | 0 |
| 745.0 | 0 |
| 744.0 | 0 |
| 743.0 | 0 |
| 742.0 | 0 |
| 741.0 | 0 |
| 740.0 | 0 |
| 739.0 | 0 |
| 738.0 | 0 |
| 737.0 | 0 |
| 736.0 | 0 |
| 735.0 | 0 |
| 734.0 | 0 |
| 733.0 | 0 |
| 732.0 | 0 |
| 731.0 | 0 |
| 730.0 | 0 |
| 729.0 | 0 |
| 728.0 | 0 |
| 727.0 | 0 |
| 726.0 | 0 |
| 725.0 | 0 |
| 724.0 | 0 |
| 723.0 | 0 |
| 722.0 | 0 |
| 721.0 | 0 |
| 720.0 | 0 |
| 719.0 | 0 |
| 718.0 | 0 |
| 717.0 | 0 |
| 716.0 | 0 |
| 715.0 | 0 |
| 714.0 | 0 |
| 713.0 | 0 |
| 712.0 | 0 |
| 711.0 | 0 |
| 710.0 | 0 |
| 709.0 | 0 |
| 708.0 | 0 |
| 707.0 | 0 |
| 706.0 | 0 |
| 705.0 | 0 |
| 704.0 | 0 |
| 703.0 | 0 |
| 702.0 | 0 |
| 701.0 | 0 |
| 700.0 | 0 |
| 699.0 | 0 |
| 698.0 | 0 |
| 697.0 | 0 |
| 696.0 | 0 |
| 695.0 | 0 |
| 694.0 | 0 |
| 693.0 | 0 |
| 692.0 | 0 |
| 691.0 | 0 |
| 690.0 | 0 |
| 689.0 | 0 |
| 688.0 | 0 |
| 687.0 | 0 |
| 686.0 | 0 |
| 685.0 | 0 |
| 684.0 | 0 |
| 683.0 | 0 |
| 682.0 | 0 |
| 681.0 | 0 |
| 680.0 | 0 |
| 679.0 | 0 |
| 678.0 | 0 |
| 677.0 | 0 |
| 676.0 | 0 |
| 675.0 | 0 |
| 674.0 | 0 |
| 673.0 | 0 |
| 672.0 | 0 |
| 671.0 | 0 |
| 670.0 | 0 |
| 669.0 | 0 |
| 668.0 | 0 |
| 667.0 | 0 |
| 666.0 | 0 |
| 665.0 | 0 |
| 664.0 | 0 |
| 663.0 | 0 |
| 662.0 | 0 |
| 661.0 | 0 |
| 660.0 | 0 |
| 659.0 | 0 |
| 658.0 | 0 |
| 657.0 | 0 |
| 656.0 | 0 |
| 655.0 | 0 |
| 654.0 | 0 |
| 653.0 | 0 |
| 652.0 | 0 |
| 651.0 | 0 |
| 650.0 | 0 |
| 649.0 | 0 |
| 648.0 | 0 |
| 647.0 | 0 |
| 646.0 | 0 |
| 645.0 | 0 |
| 644.0 | 0 |
| 643.0 | 0 |
| 642.0 | 0 |
| 641.0 | 0 |
| 640.0 | 0 |
| 639.0 | 0 |
| 638.0 | 0 |
| 637.0 | 0 |
| 636.0 | 0 |
| 635.0 | 0 |
| 634.0 | 0 |
| 633.0 | 0 |
| 632.0 | 0 |
| 631.0 | 0 |
| 630.0 | 0 |
| 629.0 | 0 |
| 628.0 | 0 |
| 627.0 | 0 |
| 626.0 | 0 |
| 625.0 | 0 |
| 624.0 | 0 |
| 623.0 | 0 |
| 622.0 | 0 |
| 621.0 | 0 |
| 620.0 | 0 |
| 619.0 | 0 |
| 618.0 | 0 |
| 617.0 | 0 |
| 616.0 | 0 |
| 615.0 | 0 |
| 614.0 | 0 |
| 613.0 | 0 |
| 612.0 | 0 |
| 611.0 | 0 |
| 610.0 | 0 |
| 609.0 | 0 |
| 608.0 | 0 |
| 607.0 | 0 |
| 606.0 | 0 |
| 605.0 | 0 |
| 604.0 | 0 |
| 603.0 | 0 |
| 602.0 | 0 |
| 601.0 | 0 |
| 600.0 | 0 |
| 599.0 | 0 |
| 598.0 | 0 |
| 597.0 | 0 |
| 596.0 | 0 |
| 595.0 | 0 |
| 594.0 | 0 |
| 593.0 | 0 |
| 592.0 | 0 |
| 591.0 | 0 |
| 590.0 | 0 |
| 589.0 | 0 |
| 588.0 | 0 |
| 587.0 | 0 |
| 586.0 | 0 |
| 585.0 | 0 |
| 584.0 | 0 |
| 583.0 | 0 |
| 582.0 | 0 |
| 581.0 | 0 |
| 580.0 | 0 |
| 579.0 | 0 |
| 578.0 | 0 |
| 577.0 | 0 |
| 576.0 | 0.001 |
| 575.0 | 0.001 |
| 574.0 | 0.001 |
| 573.0 | 0.001 |
| 572.0 | 0.001 |
| 571.0 | 0.001 |
| 570.0 | 0.001 |
| 569.0 | 0.002 |
| 568.0 | 0.002 |
| 567.0 | 0.002 |
| 566.0 | 0.003 |
| 565.0 | 0.003 |
| 564.0 | 0.004 |
| 563.0 | 0.005 |
| 562.0 | 0.006 |
| 561.0 | 0.008 |
| 560.0 | 0.011 |
| 559.0 | 0.014 |
| 558.0 | 0.019 |
| 557.0 | 0.026 |
| 556.0 | 0.036 |
| 555.0 | 0.051 |
| 554.0 | 0.075 |
| 553.0 | 0.113 |
| 552.0 | 0.175 |
| 551.0 | 0.283 |
| 550.0 | 0.474 |
| 549.0 | 0.837 |
| 548.0 | 1.572 |
| 547.0 | 3.136 |
| 546.0 | 6.523 |
| 545.0 | 13.315 |
| 544.0 | 24.338 |
| 543.0 | 37.104 |
| 542.0 | 47.088 |
| 541.0 | 52.693 |
| 540.0 | 55.346 |
| 539.0 | 56.858 |
| 538.0 | 57.688 |
| 537.0 | 56.955 |
| 536.0 | 52.374 |
| 535.0 | 41.752 |
| 534.0 | 27.305 |
| 533.0 | 14.621 |
| 532.0 | 6.831 |
| 531.0 | 3.113 |
| 530.0 | 1.488 |
| 529.0 | 0.765 |
| 528.0 | 0.418 |
| 527.0 | 0.238 |
| 526.0 | 0.142 |
| 525.0 | 0.087 |
| 524.0 | 0.056 |
| 523.0 | 0.036 |
| 522.0 | 0.024 |
| 521.0 | 0.016 |
| 520.0 | 0.011 |
| 519.0 | 0.008 |
| 518.0 | 0.006 |
| 517.0 | 0.004 |
| 516.0 | 0.003 |
| 515.0 | 0.002 |
| 514.0 | 0.002 |
| 513.0 | 0.001 |
| 512.0 | 0.001 |
| 511.0 | 0.001 |
| 510.0 | 0.001 |
| 509.0 | 0 |
| 508.0 | 0 |
| 507.0 | 0 |
| 506.0 | 0 |
| 505.0 | 0 |
| 504.0 | 0 |
| 503.0 | 0 |
| 502.0 | 0 |
| 501.0 | 0 |
| 500.0 | 0 |
| 499.0 | 0 |
| 498.0 | 0 |
| 497.0 | 0 |
| 496.0 | 0 |
| 495.0 | 0 |
| 494.0 | 0 |
| 493.0 | 0 |
| 492.0 | 0 |
| 491.0 | 0 |
| 490.0 | 0 |
| 489.0 | 0 |
| 488.0 | 0 |
| 487.0 | 0 |
| 486.0 | 0 |
| 485.0 | 0 |
| 484.0 | 0 |
| 483.0 | 0 |
| 482.0 | 0 |
| 481.0 | 0 |
| 480.0 | 0 |
| 479.0 | 0 |
| 478.0 | 0 |
| 477.0 | 0 |
| 476.0 | 0 |
| 475.0 | 0 |
| 474.0 | 0 |
| 473.0 | 0 |
| 472.0 | 0 |
| 471.0 | 0 |
| 470.0 | 0 |
| 469.0 | 0 |
| 468.0 | 0 |
| 467.0 | 0 |
| 466.0 | 0 |
| 465.0 | 0 |
| 464.0 | 0 |
| 463.0 | 0 |
| 462.0 | 0 |
| 461.0 | 0 |
| 460.0 | 0 |
| 459.0 | 0 |
| 458.0 | 0 |
| 457.0 | 0 |
| 456.0 | 0 |
| 455.0 | 0 |
| 454.0 | 0 |
| 453.0 | 0.001 |
| 452.0 | 0.002 |
| 451.0 | 0.003 |
| 450.0 | 0.005 |
| 449.0 | 0.004 |
| 448.0 | 0.003 |
| 447.0 | 0.002 |
| 446.0 | 0.001 |
| 445.0 | 0.001 |
| 444.0 | 0.001 |
| 443.0 | 0.001 |
| 442.0 | 0.001 |
| 441.0 | 0.001 |
| 440.0 | 0.001 |
| 439.0 | 0.001 |
| 438.0 | 0.001 |
| 437.0 | 0.002 |
| 436.0 | 0.002 |
| 435.0 | 0.003 |
| 434.0 | 0.003 |
| 433.0 | 0.004 |
| 432.0 | 0.004 |
| 431.0 | 0.004 |
| 430.0 | 0.004 |
| 429.0 | 0.004 |
| 428.0 | 0.004 |
| 427.0 | 0.004 |
| 426.0 | 0.004 |
| 425.0 | 0.005 |
| 424.0 | 0.005 |
| 423.0 | 0.006 |
| 422.0 | 0.007 |
| 421.0 | 0.008 |
| 420.0 | 0.009 |
| 419.0 | 0.01 |
| 418.0 | 0.011 |
| 417.0 | 0.011 |
| 416.0 | 0.012 |
| 415.0 | 0.012 |
| 414.0 | 0.012 |
| 413.0 | 0.012 |
| 412.0 | 0.012 |
| 411.0 | 0.012 |
| 410.0 | 0.013 |
| 409.0 | 0.014 |
| 408.0 | 0.015 |
| 407.0 | 0.016 |
| 406.0 | 0.018 |
| 405.0 | 0.02 |
| 404.0 | 0.022 |
| 403.0 | 0.024 |
| 402.0 | 0.027 |
| 401.0 | 0.03 |
| 400.0 | 0.034 |
| 399.0 | 0.037 |
| 398.0 | 0.042 |
| 397.0 | 0.046 |
| 396.0 | 0.051 |
| 395.0 | 0.057 |
| 394.0 | 0.062 |
| 393.0 | 0.068 |
| 392.0 | 0.073 |
| 391.0 | 0.078 |
| 390.0 | 0.083 |
| 389.0 | 0.087 |
| 388.0 | 0.091 |
| 387.0 | 0.095 |
| 386.0 | 0.097 |
| 385.0 | 0.099 |
| 384.0 | 0.099 |
| 383.0 | 0.097 |
| 382.0 | 0.094 |
| 381.0 | 0.089 |
| 380.0 | 0.083 |
| 379.0 | 0.077 |
| 378.0 | 0.071 |
| 377.0 | 0.066 |
| 376.0 | 0.061 |
| 375.0 | 0.058 |
| 374.0 | 0.055 |
| 373.0 | 0.053 |
| 372.0 | 0.051 |
| 371.0 | 0.049 |
| 370.0 | 0.046 |
| 369.0 | 0.043 |
| 368.0 | 0.039 |
| 367.0 | 0.034 |
| 366.0 | 0.03 |
| 365.0 | 0.026 |
| 364.0 | 0.022 |
| 363.0 | 0.019 |
| 362.0 | 0.016 |
| 361.0 | 0.013 |
| 360.0 | 0.01 |
| 359.0 | 0.008 |
| 358.0 | 0.007 |
| 357.0 | 0.005 |
| 356.0 | 0.004 |
| 355.0 | 0.003 |
| 354.0 | 0.003 |
| 353.0 | 0.002 |
| 352.0 | 0.002 |
| 351.0 | 0.001 |
| 350.0 | 0.001 |
| 349.0 | 0.001 |
| 348.0 | 0.001 |
| 347.0 | 0.001 |
| 346.0 | 0 |
| 345.0 | 0 |
| 344.0 | 0 |
| 343.0 | 0 |
| 342.0 | 0 |
| 341.0 | 0 |
| 340.0 | 0 |
| 339.0 | 0 |
| 338.0 | 0 |
| 337.0 | 0 |
| 336.0 | 0 |
| 335.0 | 0 |
| 334.0 | 0 |
| 333.0 | 0 |
| 332.0 | 0 |
| 331.0 | 0 |
| 330.0 | 0 |
| 329.0 | 0 |
| 328.0 | 0 |
| 327.0 | 0 |
| 326.0 | 0 |
| 325.0 | 0 |
| 324.0 | 0 |
| 323.0 | 0 |
| 322.0 | 0 |
| 321.0 | 0 |
| 320.0 | 0 |
| 319.0 | 0 |
| 318.0 | 0 |
| 317.0 | 0 |
| 316.0 | 0 |
| 315.0 | 0 |
| 314.0 | 0 |
| 313.0 | 0 |
| 312.0 | 0 |
| 311.0 | 0 |
| 310.0 | 0 |
| 309.0 | 0 |
| 308.0 | 0 |
| 307.0 | 0 |
| 306.0 | 0 |
| 305.0 | 0 |
| 304.0 | 0 |
| 303.0 | 0 |
| 302.0 | 0 |
| 301.0 | 0 |
| 300.0 | 0 |
| 299.0 | 0 |
| 298.0 | 0 |
| 297.0 | 0 |
| 296.0 | 0 |
| 295.0 | 0 |
| 294.0 | 0 |
| 293.0 | 0 |
| 292.0 | 0 |
| 291.0 | 0 |
| 290.0 | 0 |
| 289.0 | 0 |
| 288.0 | 0 |
| 287.0 | 0 |
| 286.0 | 0 |
| 285.0 | 0 |
| 284.0 | 0 |
| 283.0 | 0 |
| 282.0 | 0 |
| 281.0 | 0 |
| 280.0 | 0 |
| 279.0 | 0 |
| 278.0 | 0 |
| 277.0 | 0 |
| 276.0 | 0 |
| 275.0 | 0 |
| 274.0 | 0 |
| 273.0 | 0 |
| 272.0 | 0 |
| 271.0 | 0 |
| 270.0 | 0 |
| 269.0 | 0 |
| 268.0 | 0 |
| 267.0 | 0 |
| 266.0 | 0 |
| 265.0 | 0 |
| 264.0 | 0 |
| 263.0 | 0 |
| 262.0 | 0 |
| 261.0 | 0 |
| 260.0 | 0 |
| 259.0 | 0 |
| 258.0 | 0 |
| 257.0 | 0 |
| 256.0 | 0 |
| 255.0 | 0 |
| 254.0 | 0 |
| 253.0 | 0 |
| 252.0 | 0 |
| 251.0 | 0 |
| 250.0 | 0 |
| 249.0 | 0 |
| 248.0 | 0 |
| 247.0 | 0 |
| 246.0 | 0 |
| 245.0 | 0 |
| 244.0 | 0 |
| 243.0 | 0 |
| 242.0 | 0 |
| 241.0 | 0 |
| 240.0 | 0 |
| 239.0 | 0 |
| 238.0 | 0 |
| 237.0 | 0 |
| 236.0 | 0 |
| 235.0 | 0 |
| 234.0 | 0 |
| 233.0 | 0 |
| 232.0 | 0 |
| 231.0 | 0 |
| 230.0 | 0 |
| 229.0 | 0 |
| 228.0 | 0 |
| 227.0 | 0 |
| 226.0 | 0 |
| 225.0 | 0 |
| 224.0 | 0 |
| 223.0 | 0 |
| 222.0 | 0 |
| 221.0 | 0 |
| 220.0 | 0 |
| 219.0 | 0 |
| 218.0 | 0 |
| 217.0 | 0 |
| 216.0 | 0 |
| 215.0 | 0 |
| 214.0 | 0 |
| 213.0 | 0 |
| 212.0 | 0 |
| 211.0 | 0 |
| 210.0 | 0 |
| 209.0 | 0 |
| 208.0 | 0 |
| 207.0 | 0 |
| 206.0 | 0 |
| 205.0 | 0 |
| 204.0 | 0 |
| 203.0 | 0 |
| 202.0 | 0 |
| 201.0 | 0 |